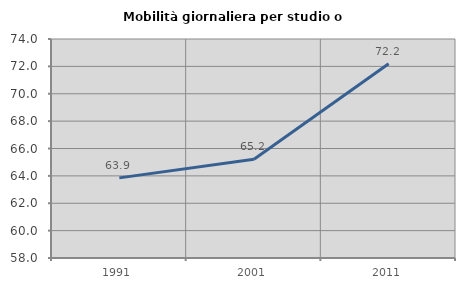
| Category | Mobilità giornaliera per studio o lavoro |
|---|---|
| 1991.0 | 63.854 |
| 2001.0 | 65.209 |
| 2011.0 | 72.193 |